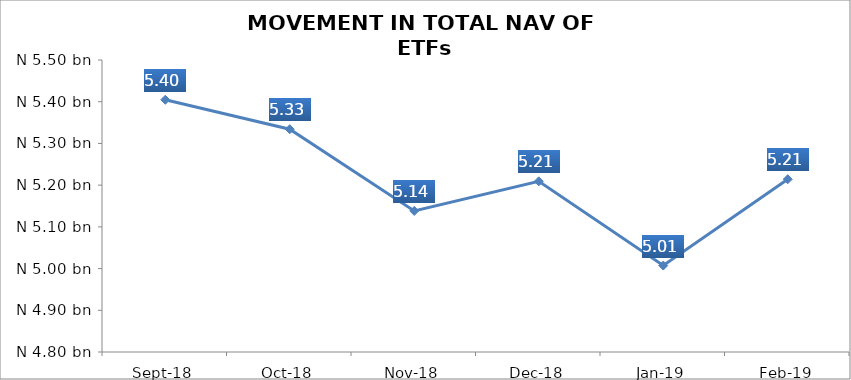
| Category | Series 0 |
|---|---|
| 2018-09-01 | 5404681331.97 |
| 2018-10-01 | 5333989892.62 |
| 2018-11-01 | 5138140059.08 |
| 2018-12-01 | 5209127720.29 |
| 2019-01-01 | 5007243642.12 |
| 2019-02-01 | 5214161600.39 |